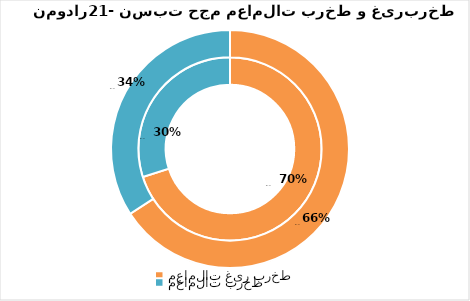
| Category | آبان 96 | آذر 96 |
|---|---|---|
| معاملات غیر برخط | 17467405841.5 | 20139200281 |
| معاملات برخط | 7467908743.5 | 10447202451 |